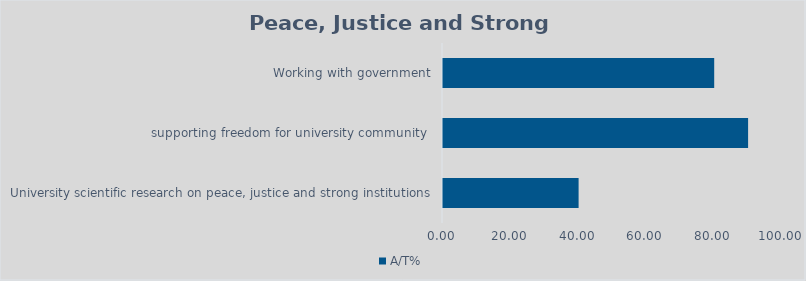
| Category | A/T% |
|---|---|
| University scientific research on peace, justice and strong institutions | 40 |
|  supporting freedom for university community  | 90 |
| Working with government | 80 |